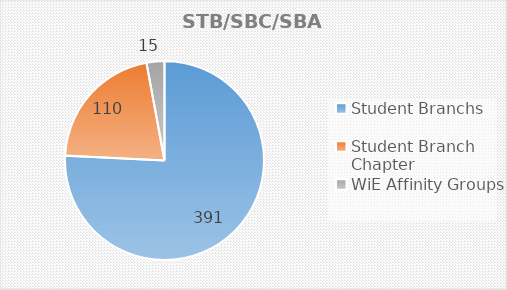
| Category | Series 0 |
|---|---|
| Student Branchs | 391 |
| Student Branch Chapter | 110 |
| WiE Affinity Groups | 15 |